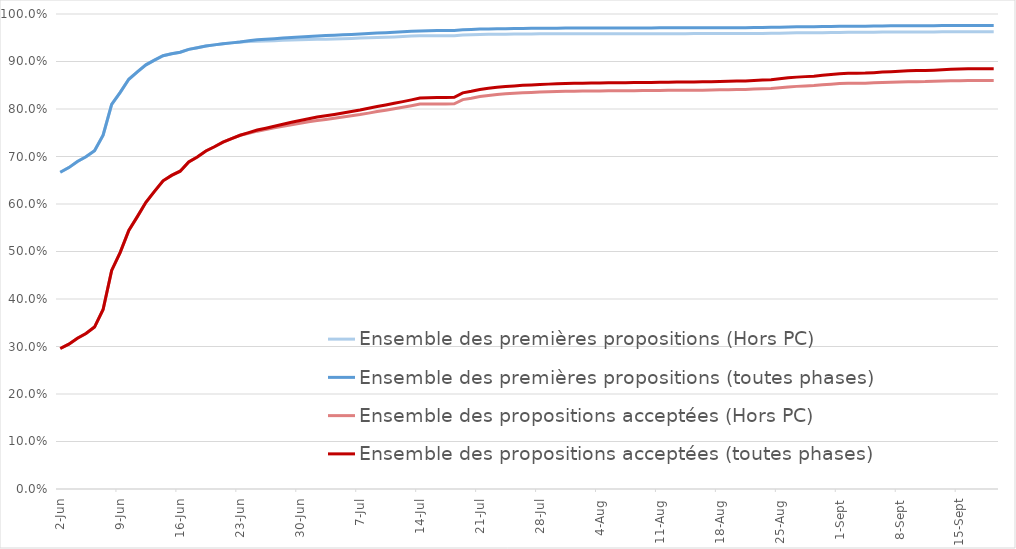
| Category | Ensemble des premières propositions (Hors PC) | Ensemble des premières propositions (toutes phases) | Ensemble des propositions acceptées (Hors PC) | Ensemble des propositions acceptées (toutes phases) |
|---|---|---|---|---|
| 2022-06-02 | 0.667 | 0.667 | 0.296 | 0.296 |
| 2022-06-03 | 0.677 | 0.677 | 0.305 | 0.305 |
| 2022-06-04 | 0.69 | 0.69 | 0.317 | 0.317 |
| 2022-06-05 | 0.7 | 0.7 | 0.327 | 0.327 |
| 2022-06-06 | 0.712 | 0.712 | 0.341 | 0.341 |
| 2022-06-07 | 0.745 | 0.745 | 0.378 | 0.378 |
| 2022-06-08 | 0.81 | 0.81 | 0.46 | 0.46 |
| 2022-06-09 | 0.835 | 0.835 | 0.498 | 0.498 |
| 2022-06-10 | 0.863 | 0.863 | 0.545 | 0.545 |
| 2022-06-11 | 0.878 | 0.878 | 0.573 | 0.573 |
| 2022-06-12 | 0.893 | 0.893 | 0.604 | 0.604 |
| 2022-06-13 | 0.903 | 0.903 | 0.627 | 0.627 |
| 2022-06-14 | 0.912 | 0.912 | 0.649 | 0.649 |
| 2022-06-15 | 0.916 | 0.916 | 0.66 | 0.66 |
| 2022-06-16 | 0.92 | 0.92 | 0.669 | 0.669 |
| 2022-06-17 | 0.926 | 0.926 | 0.688 | 0.688 |
| 2022-06-18 | 0.929 | 0.929 | 0.699 | 0.699 |
| 2022-06-19 | 0.932 | 0.932 | 0.712 | 0.712 |
| 2022-06-20 | 0.935 | 0.935 | 0.721 | 0.721 |
| 2022-06-21 | 0.937 | 0.937 | 0.73 | 0.73 |
| 2022-06-22 | 0.939 | 0.939 | 0.738 | 0.738 |
| 2022-06-23 | 0.941 | 0.941 | 0.745 | 0.745 |
| 2022-06-24 | 0.942 | 0.944 | 0.749 | 0.75 |
| 2022-06-25 | 0.943 | 0.946 | 0.753 | 0.756 |
| 2022-06-26 | 0.943 | 0.947 | 0.757 | 0.76 |
| 2022-06-27 | 0.944 | 0.948 | 0.76 | 0.764 |
| 2022-06-28 | 0.945 | 0.949 | 0.763 | 0.768 |
| 2022-06-29 | 0.945 | 0.951 | 0.767 | 0.772 |
| 2022-06-30 | 0.946 | 0.952 | 0.77 | 0.776 |
| 2022-07-01 | 0.946 | 0.953 | 0.773 | 0.78 |
| 2022-07-02 | 0.947 | 0.954 | 0.776 | 0.783 |
| 2022-07-03 | 0.947 | 0.955 | 0.778 | 0.786 |
| 2022-07-04 | 0.948 | 0.955 | 0.78 | 0.789 |
| 2022-07-05 | 0.948 | 0.956 | 0.783 | 0.792 |
| 2022-07-06 | 0.949 | 0.957 | 0.786 | 0.795 |
| 2022-07-07 | 0.949 | 0.958 | 0.788 | 0.798 |
| 2022-07-08 | 0.95 | 0.959 | 0.791 | 0.802 |
| 2022-07-09 | 0.951 | 0.96 | 0.795 | 0.805 |
| 2022-07-10 | 0.951 | 0.961 | 0.798 | 0.809 |
| 2022-07-11 | 0.952 | 0.961 | 0.801 | 0.812 |
| 2022-07-12 | 0.953 | 0.962 | 0.804 | 0.815 |
| 2022-07-13 | 0.954 | 0.964 | 0.807 | 0.819 |
| 2022-07-14 | 0.954 | 0.964 | 0.81 | 0.823 |
| 2022-07-15 | 0.954 | 0.965 | 0.81 | 0.824 |
| 2022-07-16 | 0.954 | 0.965 | 0.81 | 0.824 |
| 2022-07-17 | 0.954 | 0.965 | 0.81 | 0.824 |
| 2022-07-18 | 0.954 | 0.965 | 0.811 | 0.825 |
| 2022-07-19 | 0.956 | 0.967 | 0.82 | 0.834 |
| 2022-07-20 | 0.956 | 0.968 | 0.823 | 0.837 |
| 2022-07-21 | 0.957 | 0.968 | 0.826 | 0.841 |
| 2022-07-22 | 0.957 | 0.969 | 0.829 | 0.844 |
| 2022-07-23 | 0.957 | 0.969 | 0.831 | 0.846 |
| 2022-07-24 | 0.958 | 0.969 | 0.832 | 0.847 |
| 2022-07-25 | 0.958 | 0.969 | 0.833 | 0.849 |
| 2022-07-26 | 0.958 | 0.97 | 0.834 | 0.85 |
| 2022-07-27 | 0.958 | 0.97 | 0.835 | 0.851 |
| 2022-07-28 | 0.958 | 0.97 | 0.836 | 0.852 |
| 2022-07-29 | 0.958 | 0.97 | 0.836 | 0.852 |
| 2022-07-30 | 0.958 | 0.97 | 0.837 | 0.853 |
| 2022-07-31 | 0.958 | 0.97 | 0.837 | 0.853 |
| 2022-08-01 | 0.958 | 0.97 | 0.838 | 0.854 |
| 2022-08-02 | 0.958 | 0.97 | 0.838 | 0.854 |
| 2022-08-03 | 0.959 | 0.97 | 0.838 | 0.855 |
| 2022-08-04 | 0.959 | 0.971 | 0.838 | 0.855 |
| 2022-08-05 | 0.959 | 0.971 | 0.838 | 0.855 |
| 2022-08-06 | 0.959 | 0.971 | 0.838 | 0.855 |
| 2022-08-07 | 0.959 | 0.971 | 0.839 | 0.855 |
| 2022-08-08 | 0.959 | 0.971 | 0.839 | 0.856 |
| 2022-08-09 | 0.959 | 0.971 | 0.839 | 0.856 |
| 2022-08-10 | 0.959 | 0.971 | 0.839 | 0.856 |
| 2022-08-11 | 0.959 | 0.971 | 0.839 | 0.856 |
| 2022-08-12 | 0.959 | 0.971 | 0.839 | 0.856 |
| 2022-08-13 | 0.959 | 0.971 | 0.839 | 0.857 |
| 2022-08-14 | 0.959 | 0.971 | 0.839 | 0.857 |
| 2022-08-15 | 0.959 | 0.971 | 0.84 | 0.857 |
| 2022-08-16 | 0.959 | 0.971 | 0.84 | 0.857 |
| 2022-08-17 | 0.959 | 0.971 | 0.84 | 0.858 |
| 2022-08-18 | 0.959 | 0.971 | 0.84 | 0.858 |
| 2022-08-19 | 0.959 | 0.971 | 0.841 | 0.858 |
| 2022-08-20 | 0.959 | 0.971 | 0.841 | 0.859 |
| 2022-08-21 | 0.959 | 0.971 | 0.841 | 0.859 |
| 2022-08-22 | 0.959 | 0.971 | 0.842 | 0.86 |
| 2022-08-23 | 0.959 | 0.972 | 0.843 | 0.861 |
| 2022-08-24 | 0.959 | 0.972 | 0.843 | 0.862 |
| 2022-08-25 | 0.96 | 0.972 | 0.845 | 0.864 |
| 2022-08-26 | 0.96 | 0.973 | 0.846 | 0.866 |
| 2022-08-27 | 0.96 | 0.973 | 0.848 | 0.867 |
| 2022-08-28 | 0.96 | 0.973 | 0.849 | 0.868 |
| 2022-08-29 | 0.961 | 0.973 | 0.85 | 0.869 |
| 2022-08-30 | 0.961 | 0.974 | 0.851 | 0.871 |
| 2022-08-31 | 0.961 | 0.974 | 0.852 | 0.873 |
| 2022-09-01 | 0.961 | 0.974 | 0.854 | 0.874 |
| 2022-09-02 | 0.961 | 0.974 | 0.854 | 0.875 |
| 2022-09-03 | 0.961 | 0.974 | 0.854 | 0.876 |
| 2022-09-04 | 0.961 | 0.974 | 0.854 | 0.876 |
| 2022-09-05 | 0.962 | 0.975 | 0.855 | 0.876 |
| 2022-09-06 | 0.962 | 0.975 | 0.856 | 0.878 |
| 2022-09-07 | 0.962 | 0.975 | 0.856 | 0.879 |
| 2022-09-08 | 0.962 | 0.975 | 0.857 | 0.88 |
| 2022-09-09 | 0.962 | 0.975 | 0.858 | 0.88 |
| 2022-09-10 | 0.962 | 0.975 | 0.858 | 0.881 |
| 2022-09-11 | 0.962 | 0.975 | 0.858 | 0.881 |
| 2022-09-12 | 0.962 | 0.976 | 0.858 | 0.882 |
| 2022-09-13 | 0.963 | 0.976 | 0.859 | 0.883 |
| 2022-09-14 | 0.963 | 0.976 | 0.859 | 0.884 |
| 2022-09-15 | 0.963 | 0.976 | 0.86 | 0.884 |
| 2022-09-16 | 0.963 | 0.976 | 0.86 | 0.885 |
| 2022-09-17 | 0.963 | 0.976 | 0.86 | 0.885 |
| 2022-09-18 | 0.963 | 0.976 | 0.86 | 0.885 |
| 2022-09-19 | 0.963 | 0.976 | 0.86 | 0.885 |